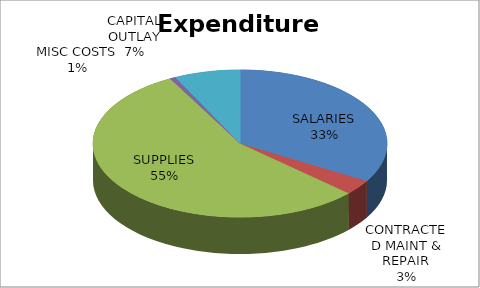
| Category | Series 0 |
|---|---|
| SALARIES | 1505137 |
| CONTRACTED MAINT & REPAIR | 148147 |
| SUPPLIES | 2487009 |
| MISCELLANEOUS COSTS | 29485 |
| CAPITAL OUTLAY | 325000 |